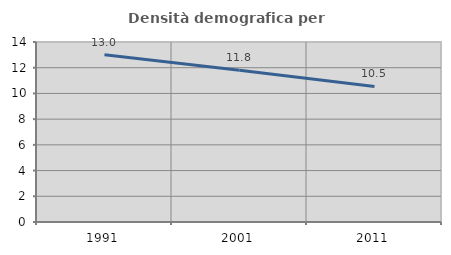
| Category | Densità demografica |
|---|---|
| 1991.0 | 13.004 |
| 2001.0 | 11.805 |
| 2011.0 | 10.54 |